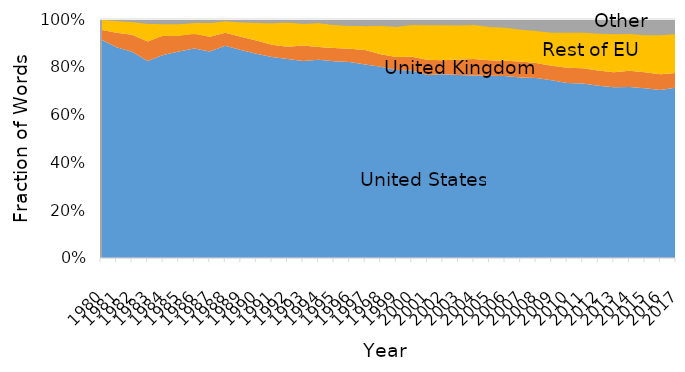
| Category | US | UK | France | Germany | Italy | Rest of Europe | Scandinavia | China | India | Other |
|---|---|---|---|---|---|---|---|---|---|---|
| 1980.0 | 0.914 | 0.041 | 0.006 | 0.012 | 0.002 | 0.018 | 0.007 | 0 | 0 | 0 |
| 1981.0 | 0.881 | 0.061 | 0.008 | 0.012 | 0.002 | 0.024 | 0.008 | 0 | 0 | 0.005 |
| 1982.0 | 0.863 | 0.071 | 0.008 | 0.012 | 0.003 | 0.025 | 0.009 | 0 | 0 | 0.009 |
| 1983.0 | 0.824 | 0.081 | 0.006 | 0.011 | 0.011 | 0.033 | 0.015 | 0.003 | 0 | 0.017 |
| 1984.0 | 0.85 | 0.081 | 0.003 | 0.006 | 0.009 | 0.021 | 0.011 | 0.003 | 0.001 | 0.017 |
| 1985.0 | 0.864 | 0.067 | 0.003 | 0.006 | 0.009 | 0.022 | 0.009 | 0.003 | 0.001 | 0.017 |
| 1986.0 | 0.877 | 0.063 | 0.002 | 0.01 | 0.009 | 0.016 | 0.008 | 0.003 | 0.001 | 0.012 |
| 1987.0 | 0.864 | 0.062 | 0.005 | 0.01 | 0.017 | 0.018 | 0.009 | 0.003 | 0.001 | 0.012 |
| 1988.0 | 0.888 | 0.055 | 0.007 | 0.008 | 0.01 | 0.02 | 0.007 | 0 | 0.002 | 0.004 |
| 1989.0 | 0.87 | 0.056 | 0.008 | 0.011 | 0.01 | 0.027 | 0.008 | 0 | 0.002 | 0.009 |
| 1990.0 | 0.854 | 0.055 | 0.01 | 0.016 | 0.01 | 0.03 | 0.01 | 0 | 0.004 | 0.009 |
| 1991.0 | 0.841 | 0.051 | 0.012 | 0.02 | 0.011 | 0.039 | 0.012 | 0 | 0.005 | 0.009 |
| 1992.0 | 0.833 | 0.051 | 0.012 | 0.025 | 0.004 | 0.047 | 0.014 | 0.004 | 0.005 | 0.005 |
| 1993.0 | 0.824 | 0.064 | 0.01 | 0.026 | 0.002 | 0.041 | 0.012 | 0.004 | 0.006 | 0.009 |
| 1994.0 | 0.829 | 0.054 | 0.012 | 0.024 | 0.003 | 0.046 | 0.014 | 0.004 | 0.005 | 0.008 |
| 1995.0 | 0.823 | 0.056 | 0.01 | 0.021 | 0.008 | 0.043 | 0.015 | 0.004 | 0.003 | 0.018 |
| 1996.0 | 0.821 | 0.055 | 0.011 | 0.018 | 0.009 | 0.041 | 0.017 | 0.007 | 0.005 | 0.018 |
| 1997.0 | 0.81 | 0.061 | 0.013 | 0.018 | 0.011 | 0.041 | 0.017 | 0.003 | 0.007 | 0.02 |
| 1998.0 | 0.8 | 0.052 | 0.015 | 0.021 | 0.013 | 0.05 | 0.02 | 0.005 | 0.006 | 0.017 |
| 1999.0 | 0.786 | 0.055 | 0.015 | 0.03 | 0.014 | 0.045 | 0.021 | 0.009 | 0.007 | 0.017 |
| 2000.0 | 0.784 | 0.058 | 0.019 | 0.033 | 0.011 | 0.049 | 0.021 | 0.009 | 0.008 | 0.007 |
| 2001.0 | 0.766 | 0.064 | 0.022 | 0.037 | 0.013 | 0.053 | 0.02 | 0.009 | 0.007 | 0.011 |
| 2002.0 | 0.768 | 0.059 | 0.025 | 0.037 | 0.013 | 0.051 | 0.02 | 0.01 | 0.008 | 0.008 |
| 2003.0 | 0.766 | 0.065 | 0.028 | 0.035 | 0.013 | 0.048 | 0.018 | 0.009 | 0.008 | 0.01 |
| 2004.0 | 0.764 | 0.069 | 0.034 | 0.031 | 0.011 | 0.049 | 0.016 | 0.008 | 0.009 | 0.009 |
| 2005.0 | 0.762 | 0.065 | 0.034 | 0.03 | 0.013 | 0.046 | 0.016 | 0.011 | 0.013 | 0.01 |
| 2006.0 | 0.761 | 0.064 | 0.035 | 0.027 | 0.012 | 0.048 | 0.016 | 0.011 | 0.015 | 0.01 |
| 2007.0 | 0.755 | 0.066 | 0.031 | 0.025 | 0.012 | 0.05 | 0.016 | 0.016 | 0.016 | 0.013 |
| 2008.0 | 0.753 | 0.063 | 0.029 | 0.027 | 0.011 | 0.05 | 0.017 | 0.019 | 0.019 | 0.012 |
| 2009.0 | 0.744 | 0.06 | 0.031 | 0.024 | 0.012 | 0.052 | 0.019 | 0.022 | 0.021 | 0.015 |
| 2010.0 | 0.732 | 0.064 | 0.034 | 0.023 | 0.011 | 0.058 | 0.021 | 0.023 | 0.019 | 0.015 |
| 2011.0 | 0.73 | 0.064 | 0.032 | 0.022 | 0.01 | 0.061 | 0.024 | 0.026 | 0.02 | 0.011 |
| 2012.0 | 0.72 | 0.064 | 0.032 | 0.024 | 0.008 | 0.064 | 0.027 | 0.027 | 0.022 | 0.012 |
| 2013.0 | 0.714 | 0.063 | 0.034 | 0.021 | 0.009 | 0.065 | 0.031 | 0.03 | 0.024 | 0.01 |
| 2014.0 | 0.715 | 0.068 | 0.029 | 0.019 | 0.01 | 0.066 | 0.03 | 0.028 | 0.028 | 0.006 |
| 2015.0 | 0.71 | 0.068 | 0.028 | 0.021 | 0.011 | 0.064 | 0.031 | 0.029 | 0.031 | 0.008 |
| 2016.0 | 0.703 | 0.066 | 0.03 | 0.022 | 0.011 | 0.067 | 0.033 | 0.028 | 0.032 | 0.008 |
| 2017.0 | 0.713 | 0.062 | 0.033 | 0.021 | 0.011 | 0.063 | 0.034 | 0.026 | 0.03 | 0.007 |